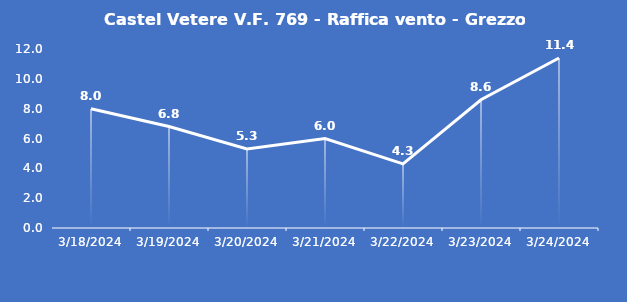
| Category | Castel Vetere V.F. 769 - Raffica vento - Grezzo (m/s) |
|---|---|
| 3/18/24 | 8 |
| 3/19/24 | 6.8 |
| 3/20/24 | 5.3 |
| 3/21/24 | 6 |
| 3/22/24 | 4.3 |
| 3/23/24 | 8.6 |
| 3/24/24 | 11.4 |